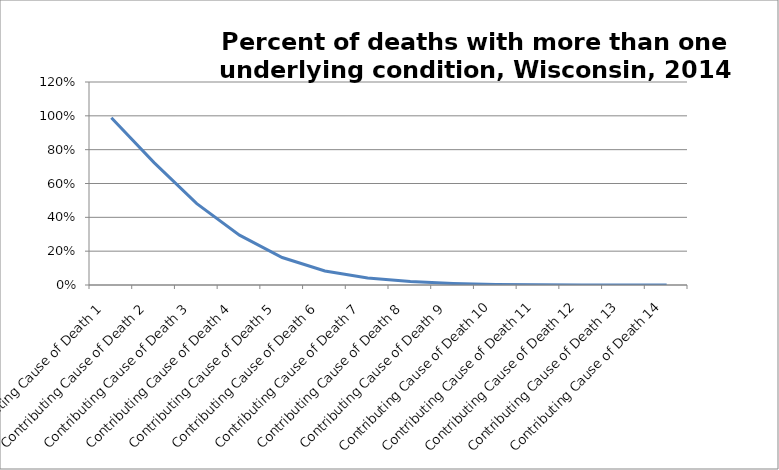
| Category | Series 0 |
|---|---|
| Contributing Cause of Death 1 | 0.988 |
| Contributing Cause of Death 2 | 0.723 |
| Contributing Cause of Death 3 | 0.481 |
| Contributing Cause of Death 4 | 0.294 |
| Contributing Cause of Death 5 | 0.162 |
| Contributing Cause of Death 6 | 0.083 |
| Contributing Cause of Death 7 | 0.041 |
| Contributing Cause of Death 8 | 0.02 |
| Contributing Cause of Death 9 | 0.009 |
| Contributing Cause of Death 10 | 0.004 |
| Contributing Cause of Death 11 | 0.002 |
| Contributing Cause of Death 12 | 0.001 |
| Contributing Cause of Death 13 | 0 |
| Contributing Cause of Death 14 | 0 |